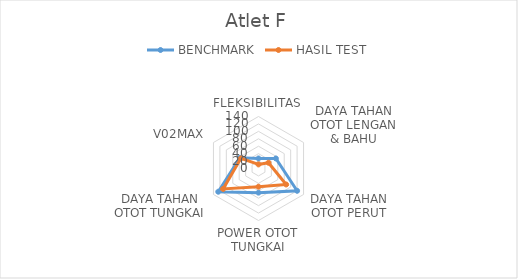
| Category | BENCHMARK | HASIL TEST |
|---|---|---|
| 0 | 27 | 11 |
| 1 | 54 | 31 |
| 2 | 120 | 86 |
| 3 | 65 | 49 |
| 4 | 125 | 110 |
| 5 | 58 | 54.7 |